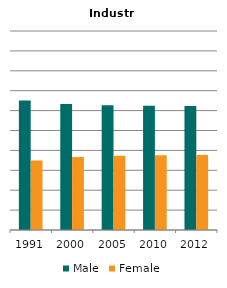
| Category | Male | Female |
|---|---|---|
| 1991.0 | 0.65 | 0.35 |
| 2000.0 | 0.633 | 0.367 |
| 2005.0 | 0.627 | 0.373 |
| 2010.0 | 0.624 | 0.376 |
| 2012.0 | 0.624 | 0.376 |